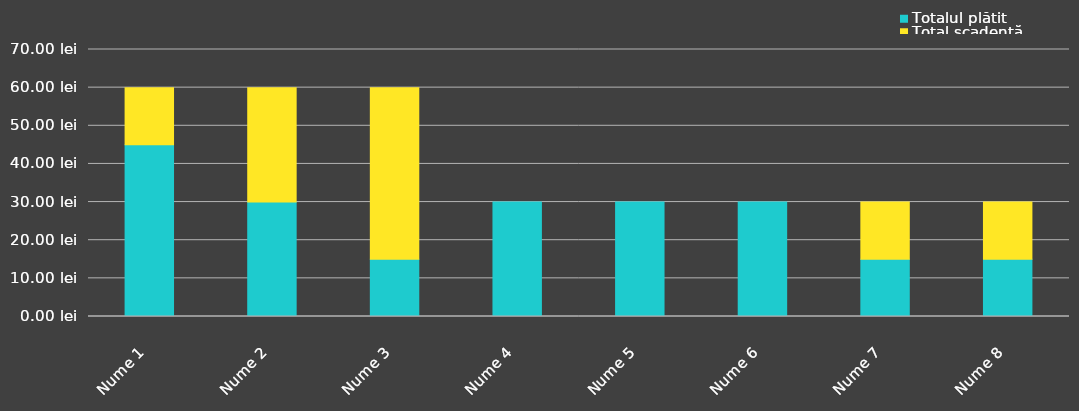
| Category | Totalul plătit | Total scadență |
|---|---|---|
| Nume 1 | 45 | 15 |
| Nume 2 | 30 | 30 |
| Nume 3 | 15 | 45 |
| Nume 4 | 30 | 0 |
| Nume 5 | 30 | 0 |
| Nume 6 | 30 | 0 |
| Nume 7 | 15 | 15 |
| Nume 8 | 15 | 15 |